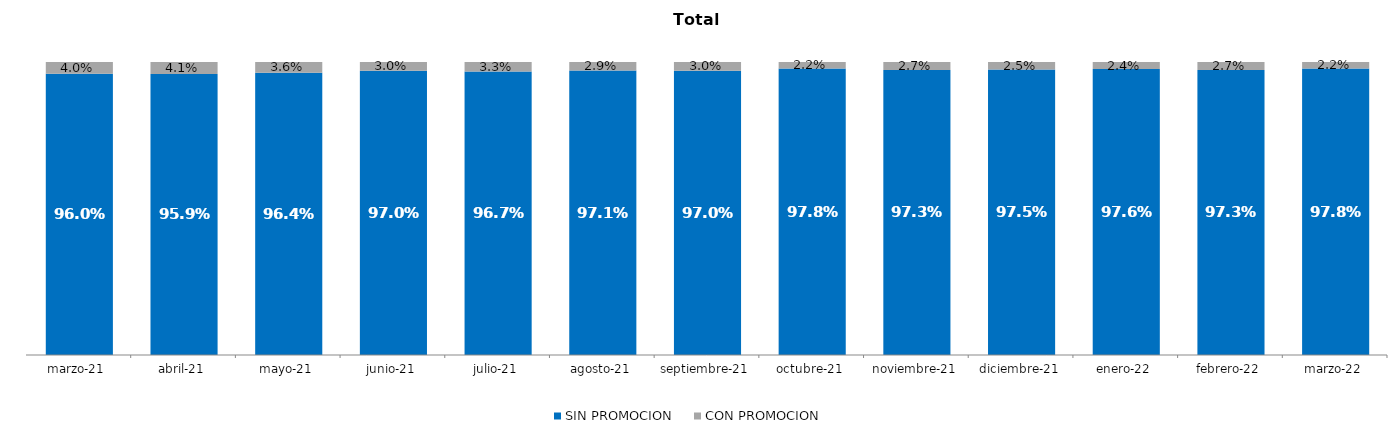
| Category | SIN PROMOCION   | CON PROMOCION   |
|---|---|---|
| 2021-03-01 | 0.96 | 0.04 |
| 2021-04-01 | 0.959 | 0.041 |
| 2021-05-01 | 0.964 | 0.036 |
| 2021-06-01 | 0.97 | 0.03 |
| 2021-07-01 | 0.967 | 0.033 |
| 2021-08-01 | 0.971 | 0.029 |
| 2021-09-01 | 0.97 | 0.03 |
| 2021-10-01 | 0.978 | 0.022 |
| 2021-11-01 | 0.973 | 0.027 |
| 2021-12-01 | 0.975 | 0.025 |
| 2022-01-01 | 0.976 | 0.024 |
| 2022-02-01 | 0.973 | 0.027 |
| 2022-03-01 | 0.978 | 0.022 |